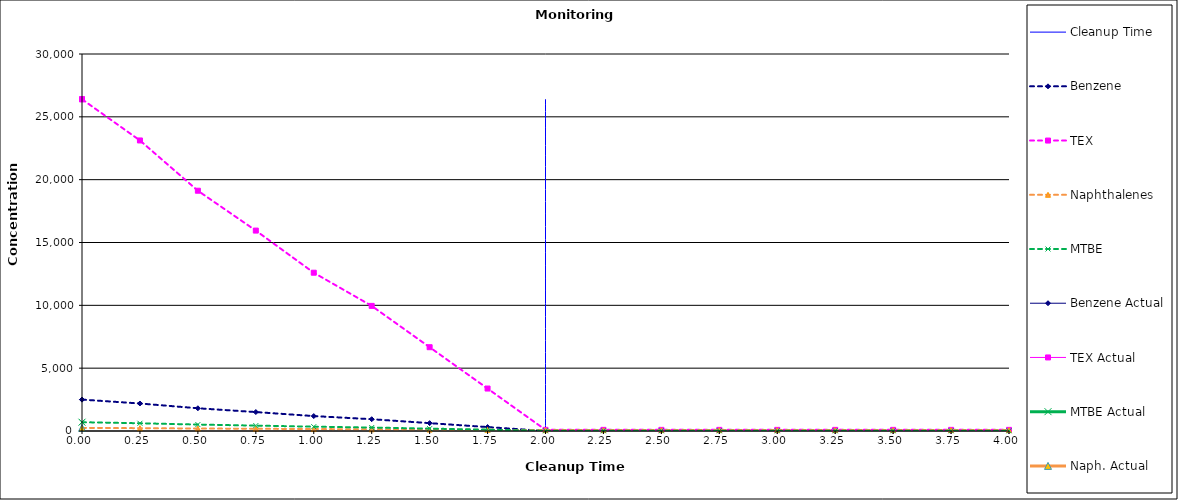
| Category | Cleanup Time |
|---|---|
| 2.0 | 0 |
| 2.0 | 26400 |